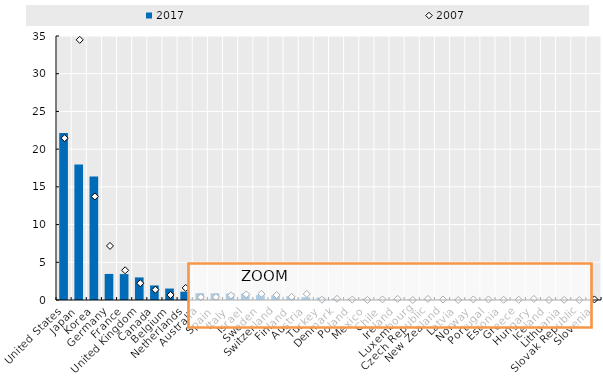
| Category | 2017 |
|---|---|
| United States | 22.153 |
| Japan | 17.979 |
| Korea | 16.36 |
| Germany | 3.458 |
| France | 3.434 |
| United Kingdom | 2.994 |
| Canada | 1.929 |
| Belgium | 1.518 |
| Netherlands | 1.095 |
| Australia | 0.916 |
| Spain | 0.889 |
| Italy | 0.872 |
| Israel | 0.864 |
| Sweden | 0.65 |
| Switzerland | 0.616 |
| Finland | 0.504 |
| Austria | 0.369 |
| Turkey | 0.337 |
| Denmark | 0.222 |
| Poland | 0.185 |
| Mexico | 0.176 |
| Chile | 0.105 |
| Ireland | 0.103 |
| Luxembourg | 0.088 |
| Czech Republic | 0.082 |
| New Zealand | 0.05 |
| Latvia | 0.047 |
| Norway | 0.035 |
| Portugal | 0.035 |
| Estonia | 0.023 |
| Greece | 0.01 |
| Hungary | 0 |
| Iceland | 0 |
| Lithuania | 0 |
| Slovak Republic | 0 |
| Slovenia | 0 |